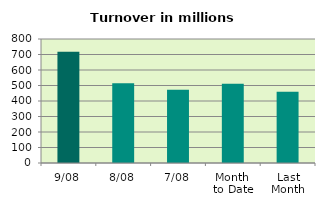
| Category | Series 0 |
|---|---|
| 9/08 | 718.357 |
| 8/08 | 515.084 |
| 7/08 | 471.845 |
| Month 
to Date | 511.587 |
| Last
Month | 459.043 |